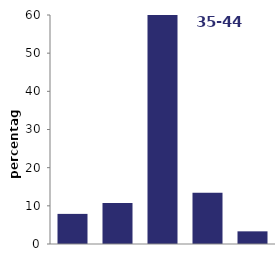
| Category | 35-44 |
|---|---|
| 0-15  | 7.89 |
| 16-20  | 10.722 |
| 21-25  | 64.624 |
| 26-30  | 13.447 |
| 31 or more | 3.317 |